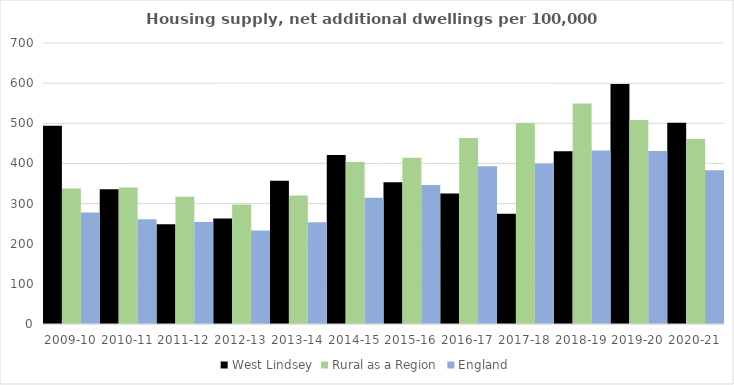
| Category | West Lindsey | Rural as a Region | England |
|---|---|---|---|
| 2009-10 | 494.155 | 337.852 | 277.548 |
| 2010-11 | 335.594 | 340.105 | 260.994 |
| 2011-12 | 248.456 | 317.04 | 254.007 |
| 2012-13 | 263.117 | 297.763 | 233.153 |
| 2013-14 | 356.864 | 319.835 | 253.602 |
| 2014-15 | 421.192 | 403.796 | 314.256 |
| 2015-16 | 352.848 | 414.091 | 346.154 |
| 2016-17 | 324.803 | 463.209 | 393.256 |
| 2017-18 | 274.539 | 500.68 | 399.646 |
| 2018-19 | 430.067 | 549.491 | 432.099 |
| 2019-20 | 597.907 | 508.493 | 431.187 |
| 2020-21 | 501.112 | 461.114 | 382.827 |